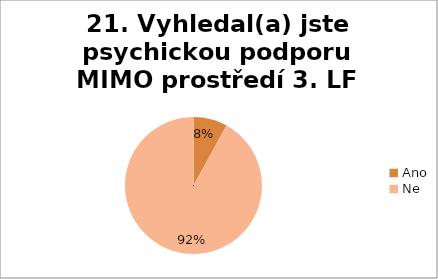
| Category | 21. Vyhledal(a) jste psychickou podporu MIMO prostředí 3. LF UK?  |
|---|---|
| Ano | 0.08 |
| Ne | 0.92 |